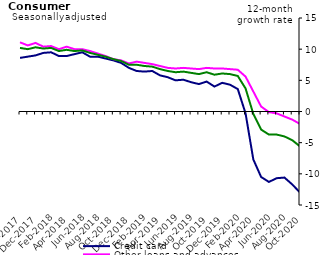
| Category | Credit card | Other loans and advances | Total |
|---|---|---|---|
| Oct-2017 | 8.6 | 11.1 | 10.2 |
| Nov-2017 | 8.8 | 10.6 | 10 |
| Dec-2017 | 9 | 11 | 10.3 |
| Jan-2018 | 9.4 | 10.4 | 10.1 |
| Feb-2018 | 9.5 | 10.5 | 10.2 |
| Mar-2018 | 8.9 | 10 | 9.7 |
| Apr-2018 | 8.9 | 10.4 | 9.9 |
| May-2018 | 9.2 | 10 | 9.7 |
| Jun-2018 | 9.5 | 10 | 9.8 |
| Jul-2018 | 8.8 | 9.7 | 9.4 |
| Aug-2018 | 8.8 | 9.3 | 9.1 |
| Sep-2018 | 8.5 | 8.9 | 8.8 |
| Oct-2018 | 8.2 | 8.4 | 8.4 |
| Nov-2018 | 7.8 | 8.2 | 8.1 |
| Dec-2018 | 7 | 7.7 | 7.5 |
| Jan-2019 | 6.5 | 8 | 7.5 |
| Feb-2019 | 6.4 | 7.8 | 7.3 |
| Mar-2019 | 6.5 | 7.6 | 7.2 |
| Apr-2019 | 5.8 | 7.3 | 6.8 |
| May-2019 | 5.5 | 7 | 6.5 |
| Jun-2019 | 5 | 6.9 | 6.3 |
| Jul-2019 | 5.1 | 7 | 6.4 |
| Aug-2019 | 4.7 | 6.9 | 6.2 |
| Sep-2019 | 4.4 | 6.8 | 6 |
| Oct-2019 | 4.8 | 7 | 6.3 |
| Nov-2019 | 4 | 6.9 | 5.9 |
| Dec-2019 | 4.6 | 6.9 | 6.1 |
| Jan-2020 | 4.3 | 6.8 | 6 |
| Feb-2020 | 3.6 | 6.7 | 5.7 |
| Mar-2020 | -0.3 | 5.6 | 3.7 |
| Apr-2020 | -7.7 | 3.2 | -0.4 |
| May-2020 | -10.5 | 0.8 | -2.9 |
| Jun-2020 | -11.3 | -0.1 | -3.7 |
| Jul-2020 | -10.7 | -0.3 | -3.7 |
| Aug-2020 | -10.6 | -0.8 | -4 |
| Sep-2020 | -11.7 | -1.3 | -4.6 |
| Oct-2020 | -13 | -2 | -5.6 |